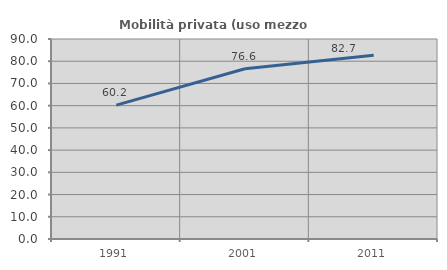
| Category | Mobilità privata (uso mezzo privato) |
|---|---|
| 1991.0 | 60.241 |
| 2001.0 | 76.632 |
| 2011.0 | 82.709 |